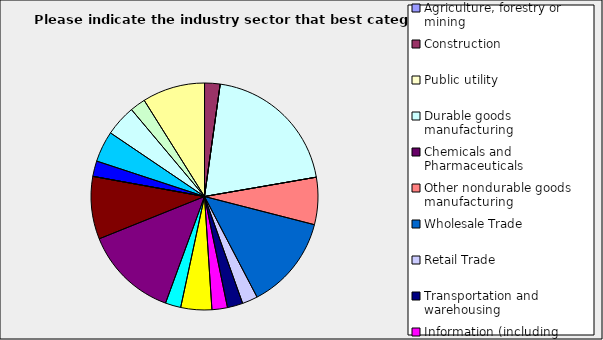
| Category | Series 0 |
|---|---|
| Agriculture, forestry or mining | 0 |
| Construction | 0.022 |
| Public utility | 0 |
| Durable goods manufacturing | 0.2 |
| Chemicals and Pharmaceuticals | 0 |
| Other nondurable goods manufacturing | 0.067 |
| Wholesale Trade | 0.133 |
| Retail Trade | 0.022 |
| Transportation and warehousing | 0.022 |
| Information (including broadcasting and telecommunication) | 0.022 |
| Finance and Insurance | 0.044 |
| Real Estate | 0.022 |
| Professional, scientific and technical services | 0.133 |
| Consulting | 0.089 |
| Administrative and office services (including waste management) | 0 |
| Education | 0.022 |
| Health Care and social services | 0.044 |
| Arts, entertainment and recreation | 0.044 |
| Accommodation and food services | 0.022 |
| Other | 0.089 |